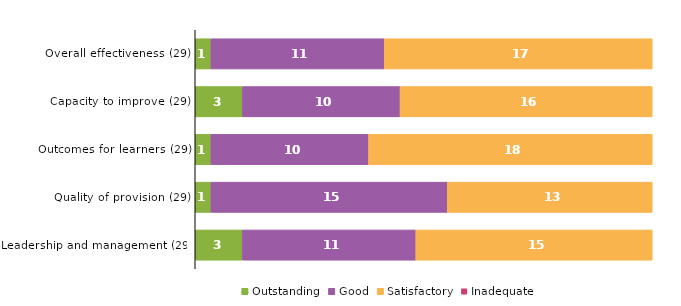
| Category | Outstanding | Good | Satisfactory | Inadequate |
|---|---|---|---|---|
| Overall effectiveness (29) | 1 | 11 | 17 | 0 |
| Capacity to improve (29) | 3 | 10 | 16 | 0 |
| Outcomes for learners (29) | 1 | 10 | 18 | 0 |
| Quality of provision (29) | 1 | 15 | 13 | 0 |
| Leadership and management (29) | 3 | 11 | 15 | 0 |